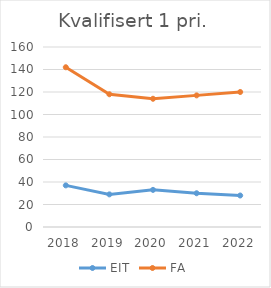
| Category | EIT | FA |
|---|---|---|
| 2018 | 37 | 142 |
| 2019 | 29 | 118 |
| 2020 | 33 | 114 |
| 2021 | 30 | 117 |
| 2022 | 28 | 120 |